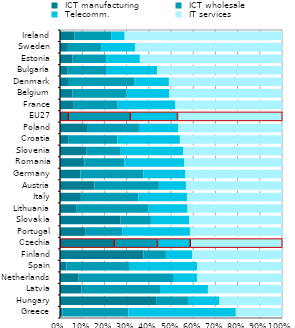
| Category |  ICT manufacturing |  ICT wholesale |  Telecomm. |  IT services |
|---|---|---|---|---|
| Greece | 0.011 | 0.297 | 0.484 | 0.208 |
| Hungary | 0.433 | 0.147 | 0.139 | 0.281 |
| Latvia | 0.097 | 0.354 | 0.216 | 0.334 |
| Netherlands | 0.084 | 0.425 | 0.109 | 0.382 |
| Spain | 0.029 | 0.282 | 0.307 | 0.382 |
| Finland | 0.376 | 0.101 | 0.118 | 0.405 |
| Czechia | 0.243 | 0.195 | 0.148 | 0.414 |
| Portugal | 0.116 | 0.166 | 0.303 | 0.415 |
| Slovakia | 0.273 | 0.136 | 0.173 | 0.417 |
| Lithuania | 0.075 | 0.323 | 0.176 | 0.426 |
| Italy | 0.094 | 0.26 | 0.218 | 0.428 |
| Austria | 0.155 | 0.29 | 0.122 | 0.433 |
| Germany | 0.092 | 0.283 | 0.188 | 0.437 |
| Romania | 0.11 | 0.18 | 0.269 | 0.44 |
| Slovenia | 0.118 | 0.156 | 0.281 | 0.445 |
| Croatia | 0.04 | 0.219 | 0.282 | 0.46 |
| Poland | 0.125 | 0.231 | 0.176 | 0.468 |
| EU27 | 0.036 | 0.279 | 0.213 | 0.472 |
| France | 0.062 | 0.198 | 0.26 | 0.48 |
| Belgium | 0.055 | 0.245 | 0.193 | 0.507 |
| Denmark | 0.036 | 0.3 | 0.155 | 0.509 |
| Bulgaria | 0.034 | 0.177 | 0.227 | 0.562 |
| Estonia | 0.057 | 0.153 | 0.15 | 0.64 |
| Sweden | 0.036 | 0.149 | 0.153 | 0.662 |
| Ireland | 0.064 | 0.167 | 0.061 | 0.709 |